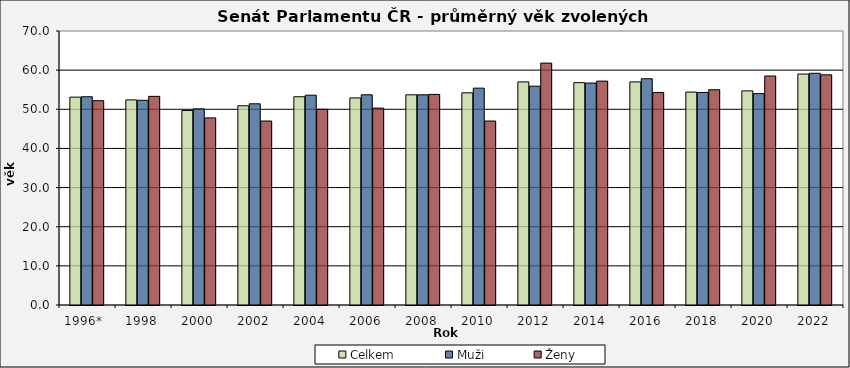
| Category | Celkem | Muži | Ženy |
|---|---|---|---|
| 1996*  | 53.1 | 53.2 | 52.2 |
| 1998 | 52.4 | 52.3 | 53.3 |
| 2000 | 49.7 | 50.1 | 47.8 |
| 2002 | 50.9 | 51.4 | 47 |
| 2004 | 53.2 | 53.6 | 50 |
| 2006 | 52.9 | 53.7 | 50.3 |
| 2008 | 53.7 | 53.7 | 53.8 |
| 2010 | 54.2 | 55.4 | 47 |
| 2012 | 57 | 55.9 | 61.8 |
| 2014 | 56.8 | 56.7 | 57.2 |
| 2016 | 57 | 57.8 | 54.3 |
| 2018 | 54.4 | 54.3 | 55 |
| 2020 | 54.7 | 54 | 58.5 |
| 2022 | 59 | 59.2 | 58.8 |